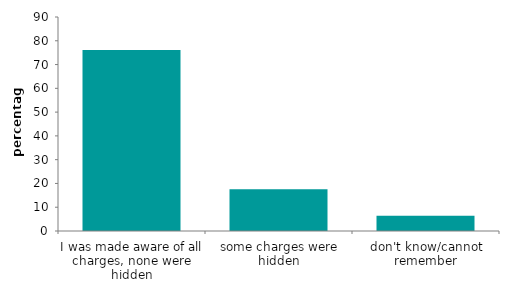
| Category | Series 0 |
|---|---|
| I was made aware of all charges, none were hidden | 76.089 |
| some charges were hidden | 17.549 |
| don't know/cannot remember | 6.362 |